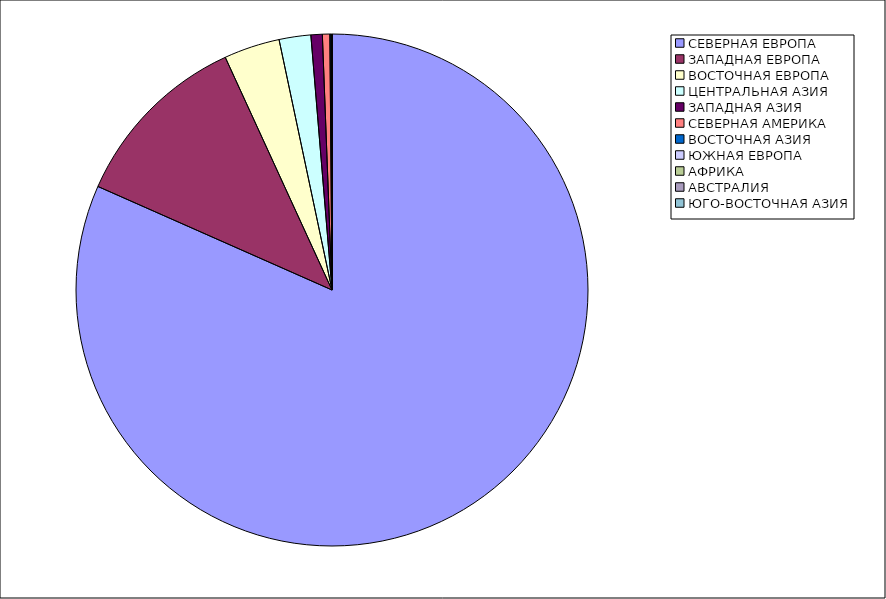
| Category | Оборот |
|---|---|
| СЕВЕРНАЯ ЕВРОПА | 81.627 |
| ЗАПАДНАЯ ЕВРОПА | 11.528 |
| ВОСТОЧНАЯ ЕВРОПА | 3.528 |
| ЦЕНТРАЛЬНАЯ АЗИЯ | 2.001 |
| ЗАПАДНАЯ АЗИЯ | 0.716 |
| СЕВЕРНАЯ АМЕРИКА | 0.469 |
| ВОСТОЧНАЯ АЗИЯ | 0.069 |
| ЮЖНАЯ ЕВРОПА | 0.046 |
| АФРИКА | 0.017 |
| АВСТРАЛИЯ | 0 |
| ЮГО-ВОСТОЧНАЯ АЗИЯ | 0 |